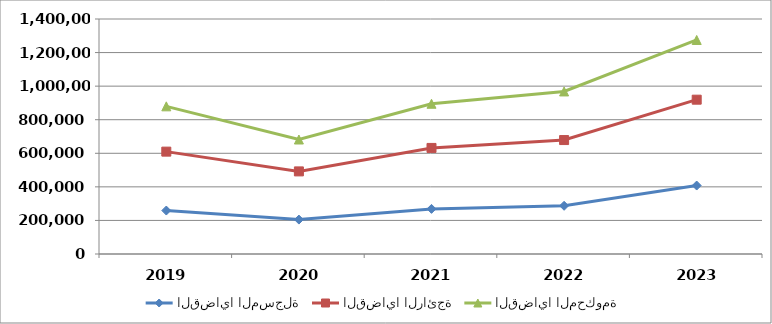
| Category | القضايا المسجلة | القضايا الرائجة | القضايا المحكومة |
|---|---|---|---|
| 2019.0 | 258943 | 350866 | 269868 |
| 2020.0 | 205022 | 287091 | 189927 |
| 2021.0 | 268757 | 363105 | 263208 |
| 2022.0 | 287234 | 391618 | 289514 |
| 2023.0 | 407815 | 511496 | 355768 |